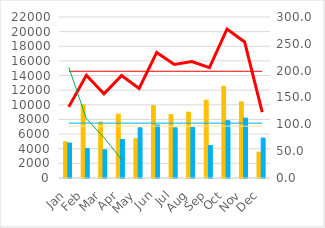
| Category | River: | Bore: |
|---|---|---|
| Jan | 4939 | 4777 |
| Feb | 10008 | 4034 |
| Mar | 7652 | 3859 |
| Apr | 8725 | 5268 |
| May | 5375 | 6863 |
| Jun | 9907 | 7250 |
| Jul | 8663 | 6854 |
| Aug | 9001 | 6919 |
| Sep | 10624 | 4449 |
| Oct | 12531 | 7833 |
| Nov | 10398 | 8185 |
| Dec | 3544 | 5464 |